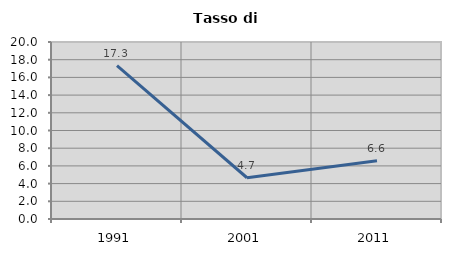
| Category | Tasso di disoccupazione   |
|---|---|
| 1991.0 | 17.331 |
| 2001.0 | 4.66 |
| 2011.0 | 6.583 |